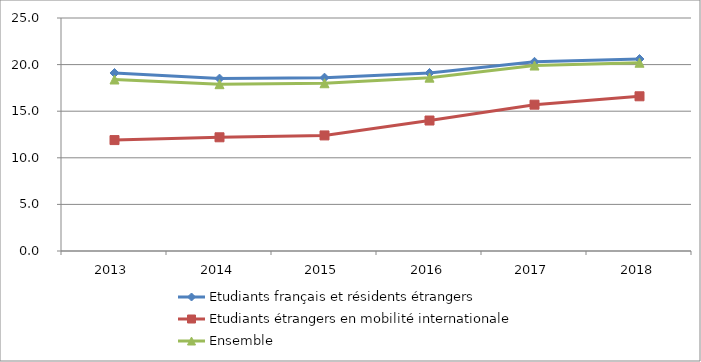
| Category | Etudiants français et résidents étrangers | Etudiants étrangers en mobilité internationale | Ensemble |
|---|---|---|---|
| 2013.0 | 19.1 | 11.9 | 18.4 |
| 2014.0 | 18.5 | 12.2 | 17.9 |
| 2015.0 | 18.6 | 12.4 | 18 |
| 2016.0 | 19.1 | 14 | 18.6 |
| 2017.0 | 20.3 | 15.7 | 19.9 |
| 2018.0 | 20.6 | 16.6 | 20.2 |